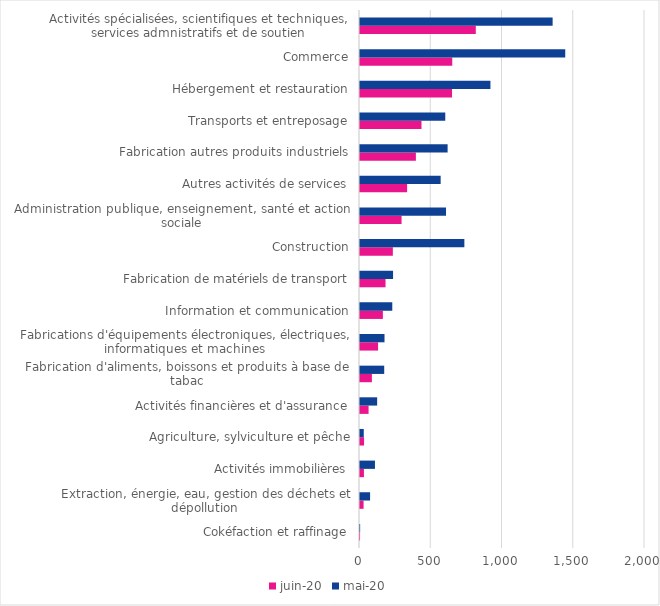
| Category | juin-20 | mai-20 |
|---|---|---|
| Cokéfaction et raffinage | 0.459 | 0.961 |
| Extraction, énergie, eau, gestion des déchets et dépollution | 25.071 | 70.769 |
| Activités immobilières | 27.598 | 104.984 |
| Agriculture, sylviculture et pêche | 28.43 | 26.381 |
| Activités financières et d'assurance | 60.148 | 120.34 |
| Fabrication d'aliments, boissons et produits à base de tabac | 83.424 | 169.927 |
| Fabrications d'équipements électroniques, électriques, informatiques et machines | 126.761 | 172.01 |
| Information et communication | 160.522 | 226.553 |
| Fabrication de matériels de transport | 179.205 | 232.028 |
| Construction | 230.527 | 732.349 |
| Administration publique, enseignement, santé et action sociale | 291.573 | 603.63 |
| Autres activités de services | 330.606 | 566.014 |
| Fabrication autres produits industriels | 392.143 | 614.837 |
| Transports et entreposage | 431.462 | 598.382 |
| Hébergement et restauration | 645.817 | 915.342 |
| Commerce | 647.435 | 1440.32 |
| Activités spécialisées, scientifiques et techniques, services admnistratifs et de soutien | 812.569 | 1351.779 |